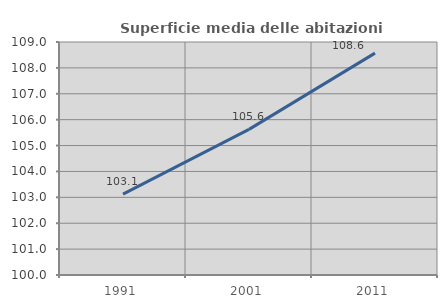
| Category | Superficie media delle abitazioni occupate |
|---|---|
| 1991.0 | 103.121 |
| 2001.0 | 105.624 |
| 2011.0 | 108.571 |